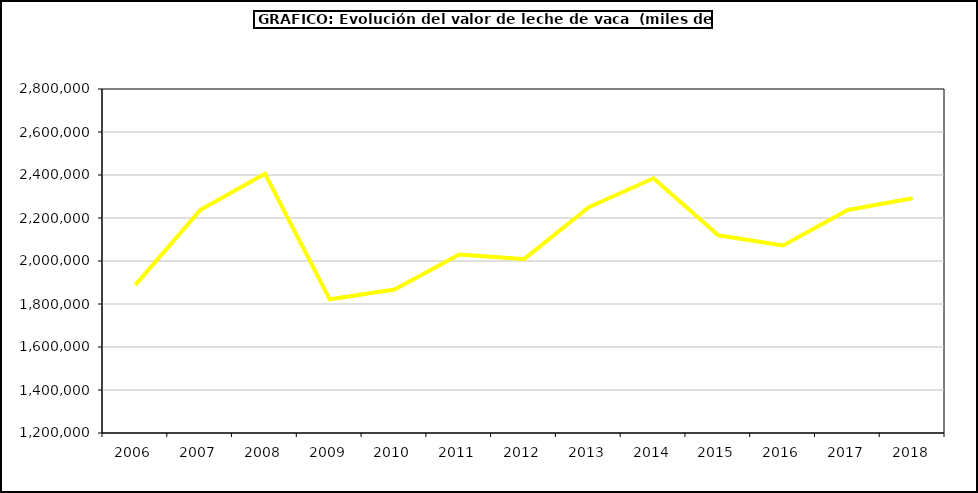
| Category | Leche de vaca |
|---|---|
| 2006.0 | 1889082.207 |
| 2007.0 | 2236712.763 |
| 2008.0 | 2406229.051 |
| 2009.0 | 1822023.094 |
| 2010.0 | 1867616.94 |
| 2011.0 | 2029996.881 |
| 2012.0 | 2008801.055 |
| 2013.0 | 2250497.404 |
| 2014.0 | 2384761.493 |
| 2015.0 | 2119762.267 |
| 2016.0 | 2072491.339 |
| 2017.0 | 2237588.977 |
| 2018.0 | 2291848.337 |